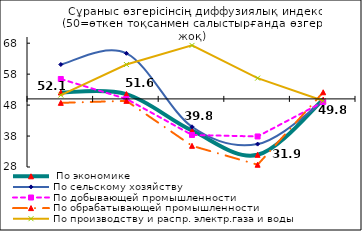
| Category |  По экономике | По сельскому хозяйству | По добывающей промышленности | По обрабатывающей промышленности | По производству и распр. электр.газа и воды |
|---|---|---|---|---|---|
| 0 | 52.085 | 61.111 | 56.436 | 48.718 | 51.235 |
| 1 | 51.56 | 64.732 | 50 | 49.372 | 61.111 |
| 2 | 39.785 | 40.991 | 38.35 | 34.842 | 67.284 |
| 3 | 31.94 | 35.398 | 37.864 | 28.732 | 56.707 |
| 4 | 49.765 | 49.115 | 49.029 | 52.147 | 49.39 |